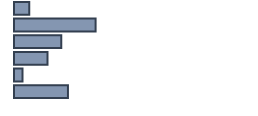
| Category | Percentatge |
|---|---|
| 0 | 6.348 |
| 1 | 34 |
| 2 | 19.696 |
| 3 | 13.913 |
| 4 | 3.565 |
| 5 | 22.478 |